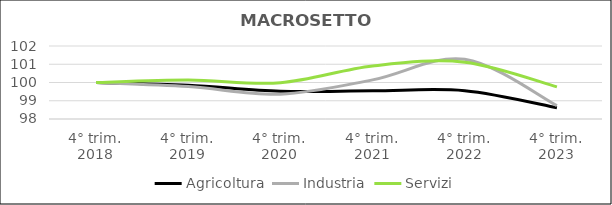
| Category | Agricoltura | Industria | Servizi |
|---|---|---|---|
| 4° trim.
2018 | 100 | 100 | 100 |
| 4° trim.
2019 | 99.848 | 99.778 | 100.135 |
| 4° trim.
2020 | 99.516 | 99.363 | 99.989 |
| 4° trim.
2021 | 99.543 | 100.143 | 100.904 |
| 4° trim.
2022 | 99.55 | 101.275 | 101.113 |
| 4° trim.
2023 | 98.616 | 98.733 | 99.763 |